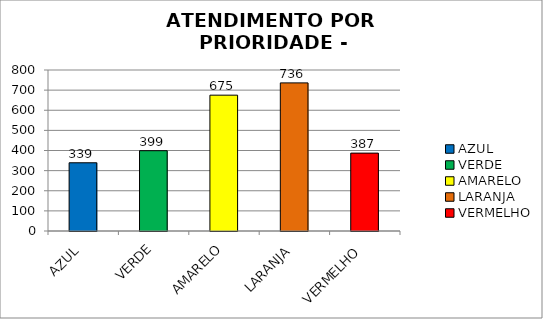
| Category | Total Regional: |
|---|---|
| AZUL | 339 |
| VERDE | 399 |
| AMARELO | 675 |
| LARANJA | 736 |
| VERMELHO | 387 |